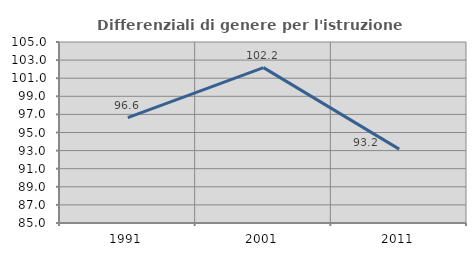
| Category | Differenziali di genere per l'istruzione superiore |
|---|---|
| 1991.0 | 96.642 |
| 2001.0 | 102.167 |
| 2011.0 | 93.166 |